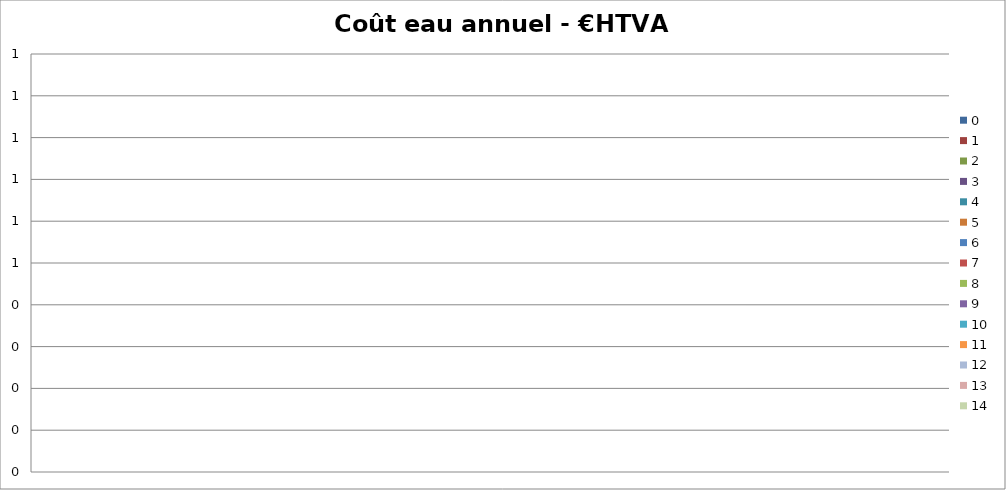
| Category | 0 | 1 | 2 | 3 | 4 | 5 | 6 | 7 | 8 | 9 | 10 | 11 | 12 | 13 | 14 |
|---|---|---|---|---|---|---|---|---|---|---|---|---|---|---|---|
| TOTAL | 0 | 0 | 0 | 0 | 0 | 0 | 0 | 0 | 0 | 0 | 0 | 0 | 0 | 0 | 0 |